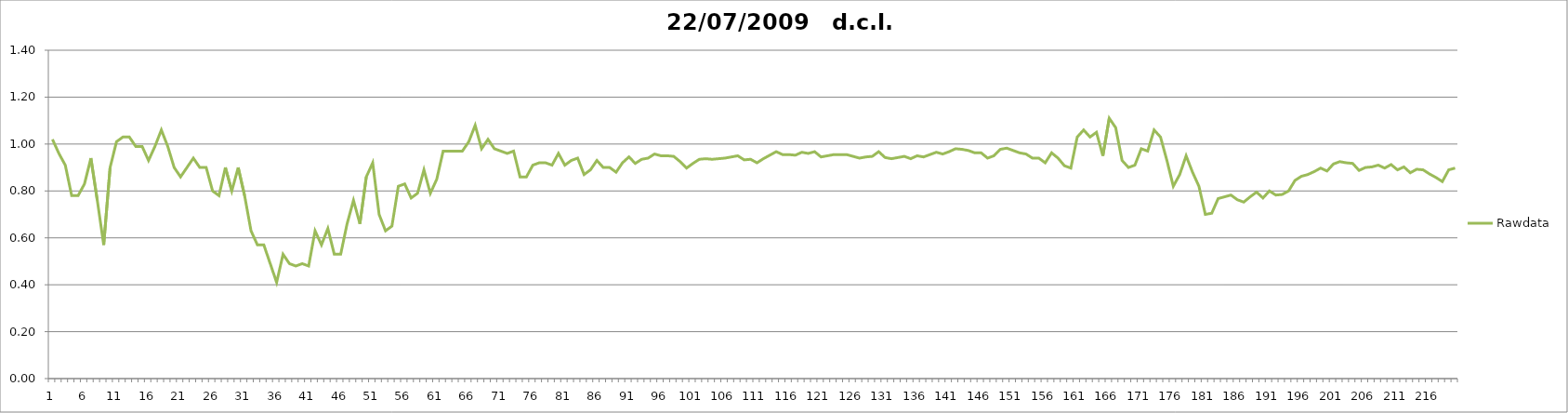
| Category | Rawdata |
|---|---|
| 0 | 1.02 |
| 1 | 0.96 |
| 2 | 0.91 |
| 3 | 0.78 |
| 4 | 0.78 |
| 5 | 0.83 |
| 6 | 0.94 |
| 7 | 0.76 |
| 8 | 0.57 |
| 9 | 0.9 |
| 10 | 1.01 |
| 11 | 1.03 |
| 12 | 1.03 |
| 13 | 0.99 |
| 14 | 0.99 |
| 15 | 0.93 |
| 16 | 0.99 |
| 17 | 1.06 |
| 18 | 0.99 |
| 19 | 0.9 |
| 20 | 0.86 |
| 21 | 0.9 |
| 22 | 0.94 |
| 23 | 0.9 |
| 24 | 0.9 |
| 25 | 0.8 |
| 26 | 0.78 |
| 27 | 0.9 |
| 28 | 0.8 |
| 29 | 0.9 |
| 30 | 0.78 |
| 31 | 0.63 |
| 32 | 0.57 |
| 33 | 0.57 |
| 34 | 0.49 |
| 35 | 0.41 |
| 36 | 0.53 |
| 37 | 0.49 |
| 38 | 0.48 |
| 39 | 0.49 |
| 40 | 0.48 |
| 41 | 0.63 |
| 42 | 0.57 |
| 43 | 0.64 |
| 44 | 0.53 |
| 45 | 0.53 |
| 46 | 0.66 |
| 47 | 0.76 |
| 48 | 0.66 |
| 49 | 0.86 |
| 50 | 0.92 |
| 51 | 0.7 |
| 52 | 0.63 |
| 53 | 0.65 |
| 54 | 0.82 |
| 55 | 0.83 |
| 56 | 0.77 |
| 57 | 0.79 |
| 58 | 0.89 |
| 59 | 0.79 |
| 60 | 0.85 |
| 61 | 0.97 |
| 62 | 0.97 |
| 63 | 0.97 |
| 64 | 0.97 |
| 65 | 1.01 |
| 66 | 1.08 |
| 67 | 0.98 |
| 68 | 1.02 |
| 69 | 0.98 |
| 70 | 0.97 |
| 71 | 0.96 |
| 72 | 0.97 |
| 73 | 0.86 |
| 74 | 0.86 |
| 75 | 0.91 |
| 76 | 0.92 |
| 77 | 0.92 |
| 78 | 0.91 |
| 79 | 0.96 |
| 80 | 0.91 |
| 81 | 0.93 |
| 82 | 0.94 |
| 83 | 0.87 |
| 84 | 0.89 |
| 85 | 0.93 |
| 86 | 0.9 |
| 87 | 0.9 |
| 88 | 0.88 |
| 89 | 0.92 |
| 90 | 0.945 |
| 91 | 0.918 |
| 92 | 0.935 |
| 93 | 0.94 |
| 94 | 0.958 |
| 95 | 0.95 |
| 96 | 0.95 |
| 97 | 0.948 |
| 98 | 0.925 |
| 99 | 0.898 |
| 100 | 0.918 |
| 101 | 0.935 |
| 102 | 0.938 |
| 103 | 0.935 |
| 104 | 0.938 |
| 105 | 0.94 |
| 106 | 0.945 |
| 107 | 0.95 |
| 108 | 0.932 |
| 109 | 0.935 |
| 110 | 0.92 |
| 111 | 0.938 |
| 112 | 0.952 |
| 113 | 0.968 |
| 114 | 0.955 |
| 115 | 0.955 |
| 116 | 0.952 |
| 117 | 0.965 |
| 118 | 0.96 |
| 119 | 0.968 |
| 120 | 0.945 |
| 121 | 0.95 |
| 122 | 0.955 |
| 123 | 0.955 |
| 124 | 0.955 |
| 125 | 0.948 |
| 126 | 0.94 |
| 127 | 0.945 |
| 128 | 0.948 |
| 129 | 0.968 |
| 130 | 0.943 |
| 131 | 0.938 |
| 132 | 0.942 |
| 133 | 0.948 |
| 134 | 0.938 |
| 135 | 0.95 |
| 136 | 0.945 |
| 137 | 0.955 |
| 138 | 0.965 |
| 139 | 0.958 |
| 140 | 0.968 |
| 141 | 0.98 |
| 142 | 0.978 |
| 143 | 0.972 |
| 144 | 0.962 |
| 145 | 0.962 |
| 146 | 0.94 |
| 147 | 0.95 |
| 148 | 0.977 |
| 149 | 0.982 |
| 150 | 0.972 |
| 151 | 0.962 |
| 152 | 0.958 |
| 153 | 0.94 |
| 154 | 0.94 |
| 155 | 0.92 |
| 156 | 0.962 |
| 157 | 0.94 |
| 158 | 0.908 |
| 159 | 0.898 |
| 160 | 1.03 |
| 161 | 1.06 |
| 162 | 1.03 |
| 163 | 1.05 |
| 164 | 0.95 |
| 165 | 1.11 |
| 166 | 1.07 |
| 167 | 0.93 |
| 168 | 0.9 |
| 169 | 0.91 |
| 170 | 0.98 |
| 171 | 0.97 |
| 172 | 1.06 |
| 173 | 1.03 |
| 174 | 0.93 |
| 175 | 0.82 |
| 176 | 0.87 |
| 177 | 0.95 |
| 178 | 0.88 |
| 179 | 0.82 |
| 180 | 0.7 |
| 181 | 0.705 |
| 182 | 0.768 |
| 183 | 0.775 |
| 184 | 0.783 |
| 185 | 0.763 |
| 186 | 0.753 |
| 187 | 0.775 |
| 188 | 0.795 |
| 189 | 0.77 |
| 190 | 0.8 |
| 191 | 0.783 |
| 192 | 0.785 |
| 193 | 0.8 |
| 194 | 0.845 |
| 195 | 0.863 |
| 196 | 0.87 |
| 197 | 0.883 |
| 198 | 0.898 |
| 199 | 0.885 |
| 200 | 0.915 |
| 201 | 0.925 |
| 202 | 0.92 |
| 203 | 0.918 |
| 204 | 0.888 |
| 205 | 0.9 |
| 206 | 0.903 |
| 207 | 0.91 |
| 208 | 0.898 |
| 209 | 0.912 |
| 210 | 0.89 |
| 211 | 0.903 |
| 212 | 0.878 |
| 213 | 0.893 |
| 214 | 0.89 |
| 215 | 0.873 |
| 216 | 0.858 |
| 217 | 0.84 |
| 218 | 0.89 |
| 219 | 0.898 |